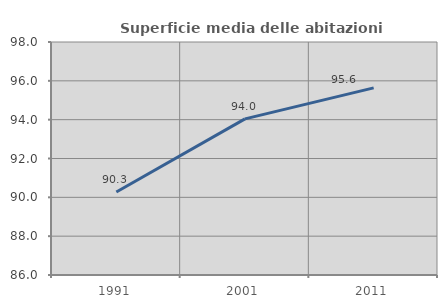
| Category | Superficie media delle abitazioni occupate |
|---|---|
| 1991.0 | 90.277 |
| 2001.0 | 94.041 |
| 2011.0 | 95.639 |